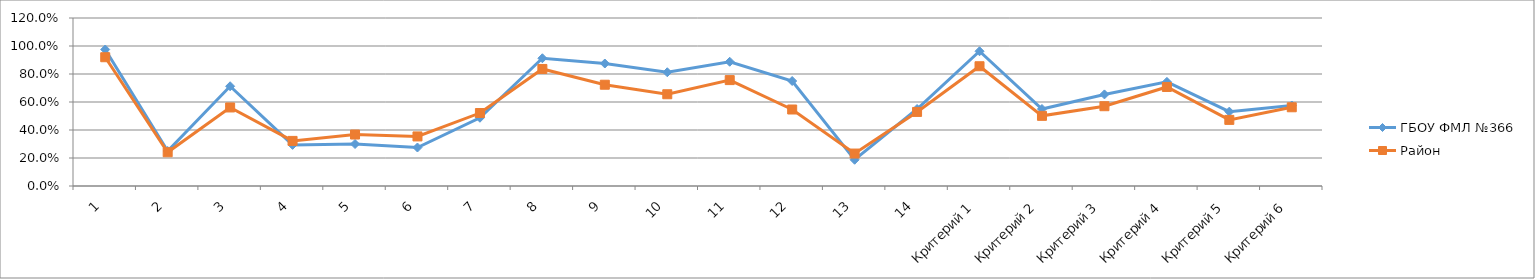
| Category | ГБОУ ФМЛ №366 | Район |
|---|---|---|
| 1 | 0.975 | 0.92 |
| 2 | 0.25 | 0.241 |
| 3 | 0.712 | 0.561 |
| 4 | 0.294 | 0.322 |
| 5 | 0.3 | 0.368 |
| 6 | 0.275 | 0.354 |
| 7 | 0.488 | 0.521 |
| 8 | 0.912 | 0.836 |
| 9 | 0.875 | 0.723 |
| 10 | 0.812 | 0.655 |
| 11 | 0.888 | 0.756 |
| 12 | 0.75 | 0.546 |
| 13 | 0.188 | 0.232 |
| 14 | 0.55 | 0.529 |
| Критерий 1 | 0.962 | 0.855 |
| Критерий 2 | 0.55 | 0.501 |
| Критерий 3 | 0.654 | 0.57 |
| Критерий 4 | 0.744 | 0.707 |
| Критерий 5 | 0.531 | 0.472 |
| Критерий 6 | 0.575 | 0.562 |